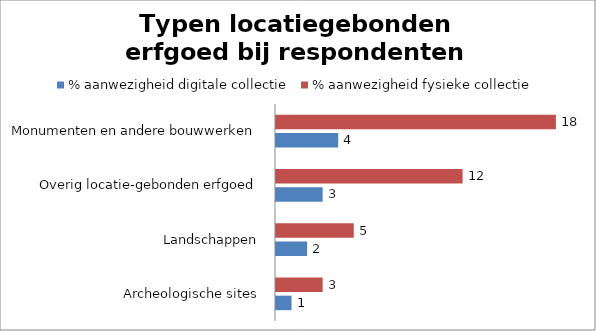
| Category | % aanwezigheid digitale collectie | % aanwezigheid fysieke collectie |
|---|---|---|
| Archeologische sites | 1 | 3 |
| Landschappen | 2 | 5 |
| Overig locatie-gebonden erfgoed | 3 | 12 |
| Monumenten en andere bouwwerken | 4 | 18 |